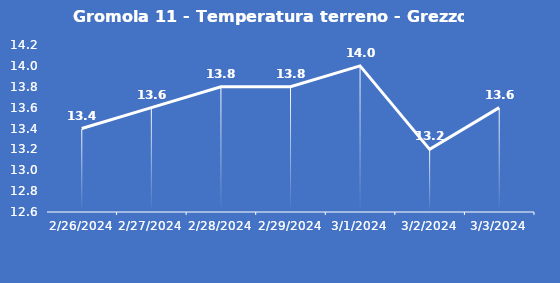
| Category | Gromola 11 - Temperatura terreno - Grezzo (°C) |
|---|---|
| 2/26/24 | 13.4 |
| 2/27/24 | 13.6 |
| 2/28/24 | 13.8 |
| 2/29/24 | 13.8 |
| 3/1/24 | 14 |
| 3/2/24 | 13.2 |
| 3/3/24 | 13.6 |